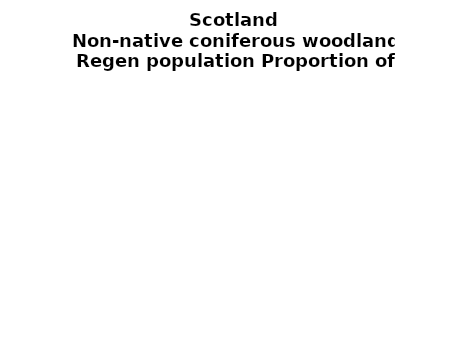
| Category | Non-native coniferous woodland |
|---|---|
| None | 0.113 |
| Seedlings only | 0 |
| Seedlings, saplings only | 0.055 |
| Seedlings, saplings, <7 cm trees | 0.095 |
| Saplings only | 0.121 |
| <7 cm trees, seedlings only | 0 |
| <7 cm trees, saplings only | 0.338 |
| <7 cm Trees only | 0.279 |